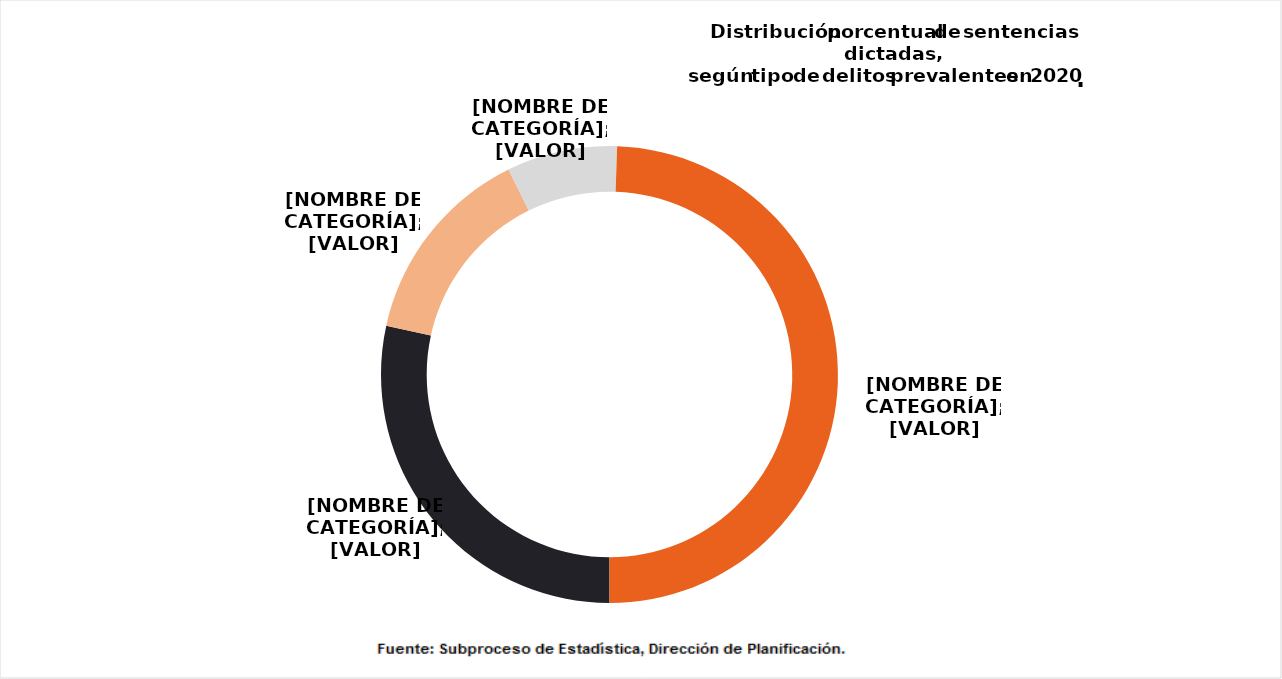
| Category | Distribución porcentual |
|---|---|
| Violación | 0.284 |
| Otros delitos sexuales | 0.143 |
| Abusos sexuales contra mayores de edad | 0.078 |
| Abusos sexuales contra menores de edad | 0.495 |